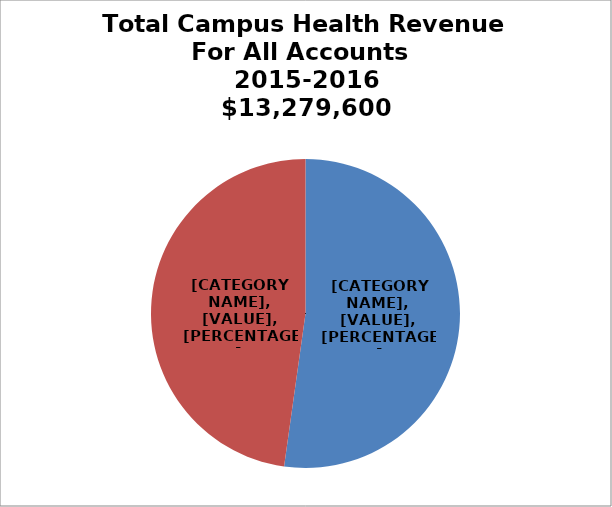
| Category | Series 0 |
|---|---|
| Local/Non-Hlth & Rec | 6933900 |
| Health & Rec | 6345700 |